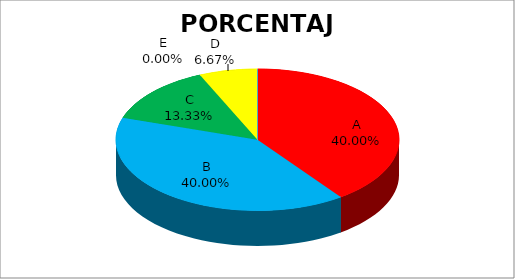
| Category | Series 0 |
|---|---|
| A | 6 |
| B | 6 |
| C | 2 |
| D | 1 |
| E | 0 |